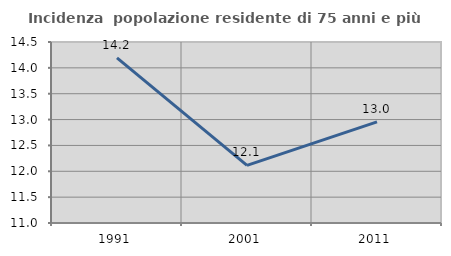
| Category | Incidenza  popolazione residente di 75 anni e più |
|---|---|
| 1991.0 | 14.194 |
| 2001.0 | 12.113 |
| 2011.0 | 12.955 |